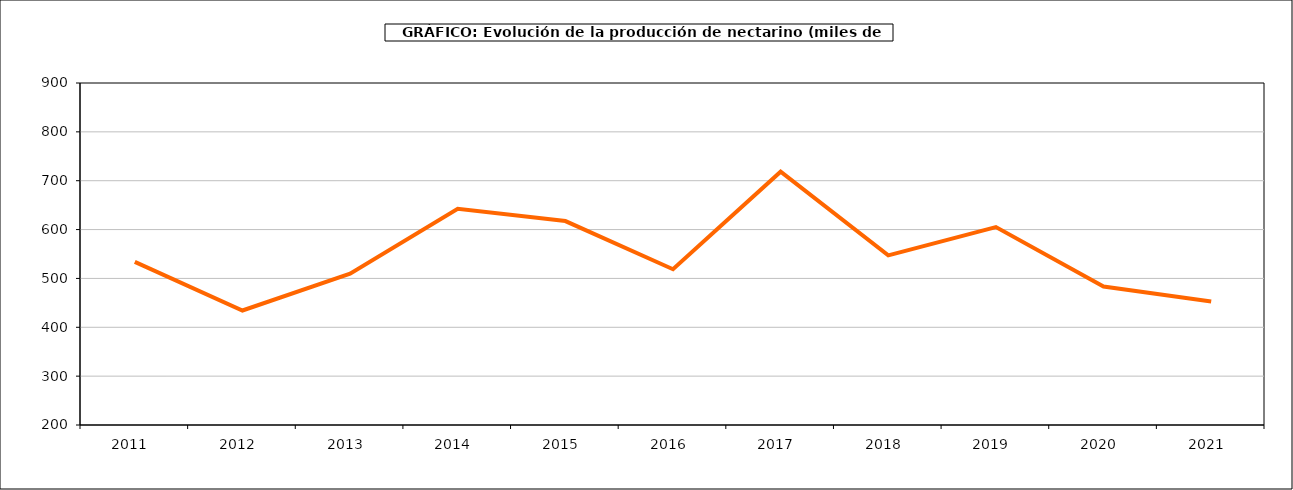
| Category | producción melocotonero |
|---|---|
| 2011.0 | 533.971 |
| 2012.0 | 434.327 |
| 2013.0 | 509.713 |
| 2014.0 | 642.573 |
| 2015.0 | 617.396 |
| 2016.0 | 518.794 |
| 2017.0 | 718.528 |
| 2018.0 | 547.119 |
| 2019.0 | 605.108 |
| 2020.0 | 483.555 |
| 2021.0 | 452.73 |